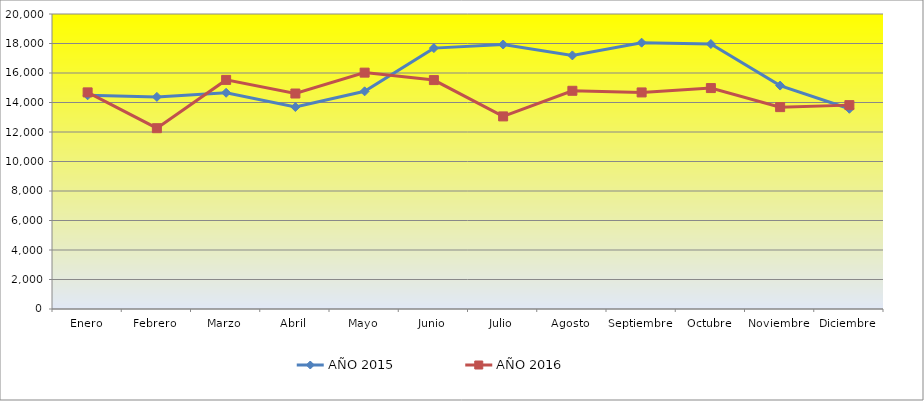
| Category | AÑO 2015 | AÑO 2016 |
|---|---|---|
| Enero | 14489 | 14686 |
| Febrero | 14381 | 12258 |
| Marzo | 14659 | 15532 |
| Abril | 13693 | 14609 |
| Mayo | 14757 | 16025 |
| Junio | 17687 | 15520 |
| Julio | 17932 | 13058 |
| Agosto | 17193 | 14794 |
| Septiembre | 18057 | 14683 |
| Octubre | 17963 | 14978 |
| Noviembre | 15148 | 13686 |
| Diciembre | 13574 | 13822 |